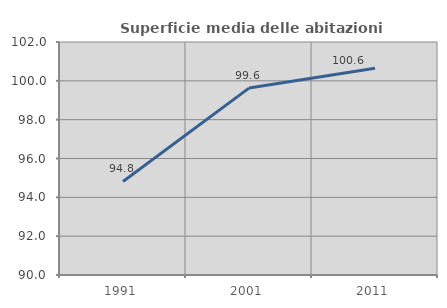
| Category | Superficie media delle abitazioni occupate |
|---|---|
| 1991.0 | 94.818 |
| 2001.0 | 99.627 |
| 2011.0 | 100.65 |